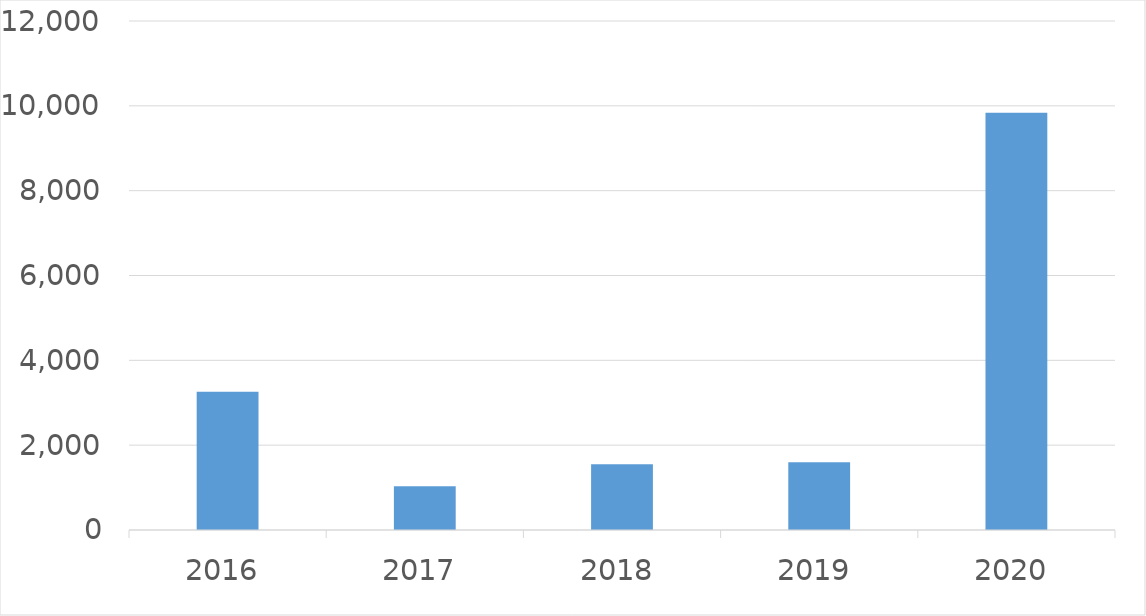
| Category | Series 0 |
|---|---|
| 2016 | 3257 |
| 2017 | 1029 |
| 2018 | 1552 |
| 2019 | 1600 |
| 2020 | 9835 |